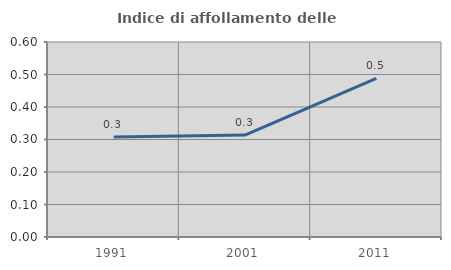
| Category | Indice di affollamento delle abitazioni  |
|---|---|
| 1991.0 | 0.308 |
| 2001.0 | 0.314 |
| 2011.0 | 0.488 |